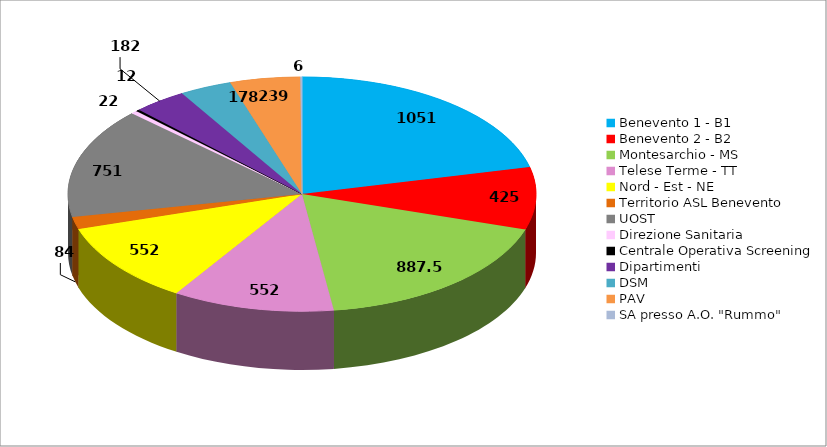
| Category | Series 0 |
|---|---|
| Benevento 1 - B1 | 1051 |
| Benevento 2 - B2 | 425 |
| Montesarchio - MS | 887.5 |
| Telese Terme - TT | 552 |
| Nord - Est - NE | 552 |
| Territorio ASL Benevento | 84 |
| UOST | 751 |
| Direzione Sanitaria | 22 |
| Centrale Operativa Screening | 12 |
| Dipartimenti | 182 |
| DSM | 178 |
| PAV | 239 |
| SA presso A.O. "Rummo" | 6 |